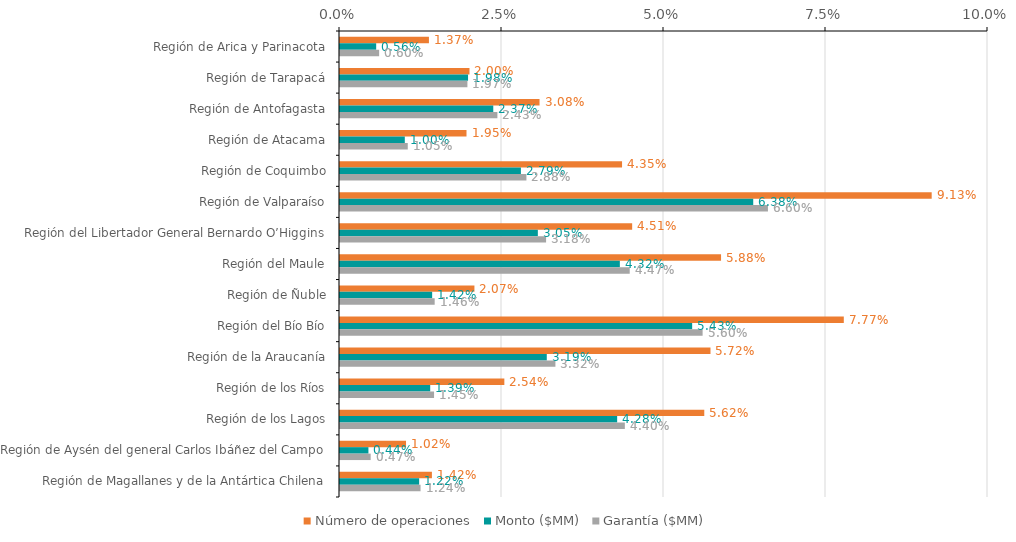
| Category | Número de operaciones | Monto ($MM) | Garantía ($MM) |
|---|---|---|---|
| Región de Arica y Parinacota | 0.014 | 0.006 | 0.006 |
| Región de Tarapacá | 0.02 | 0.02 | 0.02 |
| Región de Antofagasta | 0.031 | 0.024 | 0.024 |
| Región de Atacama | 0.02 | 0.01 | 0.01 |
| Región de Coquimbo | 0.044 | 0.028 | 0.029 |
| Región de Valparaíso | 0.091 | 0.064 | 0.066 |
| Región del Libertador General Bernardo O’Higgins | 0.045 | 0.031 | 0.032 |
| Región del Maule | 0.059 | 0.043 | 0.045 |
| Región de Ñuble | 0.021 | 0.014 | 0.015 |
| Región del Bío Bío | 0.078 | 0.054 | 0.056 |
| Región de la Araucanía | 0.057 | 0.032 | 0.033 |
| Región de los Ríos | 0.025 | 0.014 | 0.015 |
| Región de los Lagos | 0.056 | 0.043 | 0.044 |
| Región de Aysén del general Carlos Ibáñez del Campo | 0.01 | 0.004 | 0.005 |
| Región de Magallanes y de la Antártica Chilena | 0.014 | 0.012 | 0.012 |